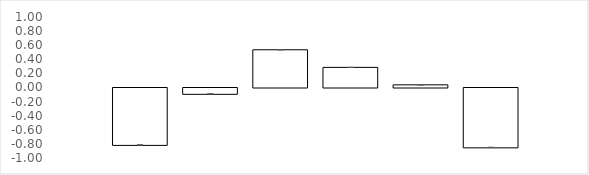
| Category | 0X NO | 1X NO | 3X NO | 0X YES | 1X YES | 3X YES |
|---|---|---|---|---|---|---|
| OX-NO | -0.814 |  |  |  |  |  |